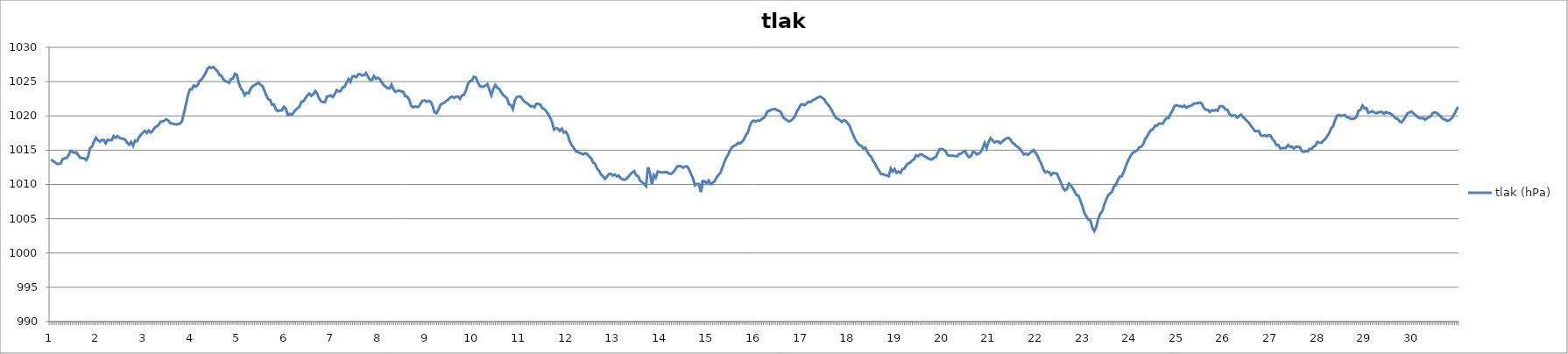
| Category | tlak (hPa) |
|---|---|
| 0 | 1013.63 |
| 1 | 1013.44 |
| 2 | 1013.25 |
| 3 | 1013 |
| 4 | 1013 |
| 5 | 1013.06 |
| 6 | 1013.69 |
| 7 | 1013.81 |
| 8 | 1013.88 |
| 9 | 1014.25 |
| 10 | 1014.88 |
| 11 | 1014.75 |
| 12 | 1014.63 |
| 13 | 1014.69 |
| 14 | 1014.25 |
| 15 | 1013.88 |
| 16 | 1013.88 |
| 17 | 1013.81 |
| 18 | 1013.56 |
| 19 | 1014.06 |
| 20 | 1015.31 |
| 21 | 1015.5 |
| 22 | 1016.25 |
| 23 | 1016.81 |
| 24 | 1016.44 |
| 25 | 1016.25 |
| 26 | 1016.5 |
| 27 | 1016.5 |
| 28 | 1016 |
| 29 | 1016.5 |
| 30 | 1016.44 |
| 31 | 1016.44 |
| 32 | 1017.06 |
| 33 | 1016.81 |
| 34 | 1017.06 |
| 35 | 1016.81 |
| 36 | 1016.69 |
| 37 | 1016.69 |
| 38 | 1016.5 |
| 39 | 1016.06 |
| 40 | 1015.81 |
| 41 | 1016.19 |
| 42 | 1015.63 |
| 43 | 1016.38 |
| 44 | 1016.31 |
| 45 | 1016.88 |
| 46 | 1017.25 |
| 47 | 1017.56 |
| 48 | 1017.81 |
| 49 | 1017.5 |
| 50 | 1017.88 |
| 51 | 1017.56 |
| 52 | 1017.81 |
| 53 | 1018.31 |
| 54 | 1018.44 |
| 55 | 1018.69 |
| 56 | 1019.13 |
| 57 | 1019.19 |
| 58 | 1019.31 |
| 59 | 1019.5 |
| 60 | 1019.31 |
| 61 | 1018.94 |
| 62 | 1018.88 |
| 63 | 1018.81 |
| 64 | 1018.75 |
| 65 | 1018.81 |
| 66 | 1018.88 |
| 67 | 1019.25 |
| 68 | 1020.44 |
| 69 | 1021.69 |
| 70 | 1023 |
| 71 | 1023.88 |
| 72 | 1023.88 |
| 73 | 1024.44 |
| 74 | 1024.25 |
| 75 | 1024.5 |
| 76 | 1025.13 |
| 77 | 1025.31 |
| 78 | 1025.75 |
| 79 | 1026.25 |
| 80 | 1026.88 |
| 81 | 1027.13 |
| 82 | 1027 |
| 83 | 1027.13 |
| 84 | 1026.81 |
| 85 | 1026.56 |
| 86 | 1026 |
| 87 | 1025.88 |
| 88 | 1025.38 |
| 89 | 1025.06 |
| 90 | 1025 |
| 91 | 1024.81 |
| 92 | 1025.38 |
| 93 | 1025.44 |
| 94 | 1026.13 |
| 95 | 1026 |
| 96 | 1024.75 |
| 97 | 1024.06 |
| 98 | 1023.63 |
| 99 | 1023 |
| 100 | 1023.38 |
| 101 | 1023.31 |
| 102 | 1023.94 |
| 103 | 1024.31 |
| 104 | 1024.5 |
| 105 | 1024.63 |
| 106 | 1024.88 |
| 107 | 1024.56 |
| 108 | 1024.38 |
| 109 | 1023.75 |
| 110 | 1023 |
| 111 | 1022.44 |
| 112 | 1022.31 |
| 113 | 1021.63 |
| 114 | 1021.63 |
| 115 | 1020.94 |
| 116 | 1020.69 |
| 117 | 1020.81 |
| 118 | 1020.81 |
| 119 | 1021.31 |
| 120 | 1021.06 |
| 121 | 1020.13 |
| 122 | 1020.31 |
| 123 | 1020.13 |
| 124 | 1020.5 |
| 125 | 1020.88 |
| 126 | 1021.13 |
| 127 | 1021.38 |
| 128 | 1022.06 |
| 129 | 1022.13 |
| 130 | 1022.56 |
| 131 | 1023 |
| 132 | 1023.25 |
| 133 | 1022.94 |
| 134 | 1023.13 |
| 135 | 1023.63 |
| 136 | 1023.25 |
| 137 | 1022.56 |
| 138 | 1022.13 |
| 139 | 1022 |
| 140 | 1022 |
| 141 | 1022.81 |
| 142 | 1022.88 |
| 143 | 1023 |
| 144 | 1022.75 |
| 145 | 1023.19 |
| 146 | 1023.75 |
| 147 | 1023.56 |
| 148 | 1023.63 |
| 149 | 1024.13 |
| 150 | 1024.25 |
| 151 | 1024.81 |
| 152 | 1025.38 |
| 153 | 1024.94 |
| 154 | 1025.75 |
| 155 | 1025.81 |
| 156 | 1025.63 |
| 157 | 1026.06 |
| 158 | 1026.06 |
| 159 | 1025.88 |
| 160 | 1025.94 |
| 161 | 1026.25 |
| 162 | 1025.69 |
| 163 | 1025.25 |
| 164 | 1025.25 |
| 165 | 1025.81 |
| 166 | 1025.44 |
| 167 | 1025.56 |
| 168 | 1025.38 |
| 169 | 1024.88 |
| 170 | 1024.5 |
| 171 | 1024.25 |
| 172 | 1024.06 |
| 173 | 1024 |
| 174 | 1024.56 |
| 175 | 1023.88 |
| 176 | 1023.5 |
| 177 | 1023.63 |
| 178 | 1023.69 |
| 179 | 1023.56 |
| 180 | 1023.5 |
| 181 | 1022.88 |
| 182 | 1022.81 |
| 183 | 1022.38 |
| 184 | 1021.5 |
| 185 | 1021.25 |
| 186 | 1021.38 |
| 187 | 1021.31 |
| 188 | 1021.38 |
| 189 | 1021.88 |
| 190 | 1022.25 |
| 191 | 1022.25 |
| 192 | 1022.06 |
| 193 | 1022.19 |
| 194 | 1022.06 |
| 195 | 1021.44 |
| 196 | 1020.5 |
| 197 | 1020.38 |
| 198 | 1020.94 |
| 199 | 1021.63 |
| 200 | 1021.81 |
| 201 | 1021.94 |
| 202 | 1022.19 |
| 203 | 1022.38 |
| 204 | 1022.69 |
| 205 | 1022.81 |
| 206 | 1022.63 |
| 207 | 1022.81 |
| 208 | 1022.81 |
| 209 | 1022.5 |
| 210 | 1023 |
| 211 | 1023.06 |
| 212 | 1023.69 |
| 213 | 1024.63 |
| 214 | 1025.06 |
| 215 | 1025.13 |
| 216 | 1025.69 |
| 217 | 1025.63 |
| 218 | 1024.94 |
| 219 | 1024.38 |
| 220 | 1024.25 |
| 221 | 1024.25 |
| 222 | 1024.44 |
| 223 | 1024.63 |
| 224 | 1023.81 |
| 225 | 1023 |
| 226 | 1023.94 |
| 227 | 1024.5 |
| 228 | 1024.13 |
| 229 | 1023.94 |
| 230 | 1023.44 |
| 231 | 1023.06 |
| 232 | 1022.81 |
| 233 | 1022.56 |
| 234 | 1021.69 |
| 235 | 1021.56 |
| 236 | 1021 |
| 237 | 1022.25 |
| 238 | 1022.75 |
| 239 | 1022.81 |
| 240 | 1022.81 |
| 241 | 1022.38 |
| 242 | 1022.06 |
| 243 | 1021.88 |
| 244 | 1021.69 |
| 245 | 1021.38 |
| 246 | 1021.44 |
| 247 | 1021.25 |
| 248 | 1021.75 |
| 249 | 1021.75 |
| 250 | 1021.63 |
| 251 | 1021.13 |
| 252 | 1021 |
| 253 | 1020.69 |
| 254 | 1020.25 |
| 255 | 1019.75 |
| 256 | 1019.13 |
| 257 | 1018 |
| 258 | 1018.19 |
| 259 | 1018.13 |
| 260 | 1017.81 |
| 261 | 1018.13 |
| 262 | 1017.56 |
| 263 | 1017.69 |
| 264 | 1017.25 |
| 265 | 1016.31 |
| 266 | 1015.75 |
| 267 | 1015.38 |
| 268 | 1014.88 |
| 269 | 1014.75 |
| 270 | 1014.63 |
| 271 | 1014.5 |
| 272 | 1014.38 |
| 273 | 1014.56 |
| 274 | 1014.44 |
| 275 | 1014.06 |
| 276 | 1013.81 |
| 277 | 1013.19 |
| 278 | 1013 |
| 279 | 1012.31 |
| 280 | 1012 |
| 281 | 1011.44 |
| 282 | 1011.19 |
| 283 | 1010.81 |
| 284 | 1011.13 |
| 285 | 1011.5 |
| 286 | 1011.56 |
| 287 | 1011.31 |
| 288 | 1011.44 |
| 289 | 1011.19 |
| 290 | 1011.31 |
| 291 | 1010.94 |
| 292 | 1010.75 |
| 293 | 1010.69 |
| 294 | 1010.81 |
| 295 | 1011.13 |
| 296 | 1011.5 |
| 297 | 1011.75 |
| 298 | 1011.94 |
| 299 | 1011.31 |
| 300 | 1011.19 |
| 301 | 1010.56 |
| 302 | 1010.31 |
| 303 | 1010.06 |
| 304 | 1009.75 |
| 305 | 1012.5 |
| 306 | 1011.69 |
| 307 | 1010.06 |
| 308 | 1011.38 |
| 309 | 1011 |
| 310 | 1011.88 |
| 311 | 1011.81 |
| 312 | 1011.75 |
| 313 | 1011.75 |
| 314 | 1011.81 |
| 315 | 1011.75 |
| 316 | 1011.56 |
| 317 | 1011.56 |
| 318 | 1011.81 |
| 319 | 1012.19 |
| 320 | 1012.63 |
| 321 | 1012.69 |
| 322 | 1012.63 |
| 323 | 1012.44 |
| 324 | 1012.63 |
| 325 | 1012.63 |
| 326 | 1012.19 |
| 327 | 1011.5 |
| 328 | 1010.88 |
| 329 | 1009.88 |
| 330 | 1010.06 |
| 331 | 1010.06 |
| 332 | 1008.88 |
| 333 | 1010.5 |
| 334 | 1010.44 |
| 335 | 1010.13 |
| 336 | 1010.56 |
| 337 | 1010.06 |
| 338 | 1010.25 |
| 339 | 1010.44 |
| 340 | 1011 |
| 341 | 1011.38 |
| 342 | 1011.69 |
| 343 | 1012.44 |
| 344 | 1013.25 |
| 345 | 1013.88 |
| 346 | 1014.38 |
| 347 | 1015 |
| 348 | 1015.44 |
| 349 | 1015.63 |
| 350 | 1015.75 |
| 351 | 1016.06 |
| 352 | 1016 |
| 353 | 1016.19 |
| 354 | 1016.56 |
| 355 | 1017.19 |
| 356 | 1017.56 |
| 357 | 1018.5 |
| 358 | 1019.13 |
| 359 | 1019.31 |
| 360 | 1019.19 |
| 361 | 1019.31 |
| 362 | 1019.31 |
| 363 | 1019.5 |
| 364 | 1019.69 |
| 365 | 1020 |
| 366 | 1020.63 |
| 367 | 1020.75 |
| 368 | 1020.88 |
| 369 | 1021 |
| 370 | 1021 |
| 371 | 1020.81 |
| 372 | 1020.75 |
| 373 | 1020.5 |
| 374 | 1019.81 |
| 375 | 1019.56 |
| 376 | 1019.38 |
| 377 | 1019.19 |
| 378 | 1019.31 |
| 379 | 1019.56 |
| 380 | 1019.88 |
| 381 | 1020.63 |
| 382 | 1021.06 |
| 383 | 1021.63 |
| 384 | 1021.69 |
| 385 | 1021.56 |
| 386 | 1021.81 |
| 387 | 1022.06 |
| 388 | 1022 |
| 389 | 1022.25 |
| 390 | 1022.38 |
| 391 | 1022.56 |
| 392 | 1022.69 |
| 393 | 1022.81 |
| 394 | 1022.63 |
| 395 | 1022.44 |
| 396 | 1021.94 |
| 397 | 1021.63 |
| 398 | 1021.25 |
| 399 | 1020.75 |
| 400 | 1020.19 |
| 401 | 1019.69 |
| 402 | 1019.56 |
| 403 | 1019.38 |
| 404 | 1019.13 |
| 405 | 1019.38 |
| 406 | 1019.25 |
| 407 | 1018.94 |
| 408 | 1018.56 |
| 409 | 1017.75 |
| 410 | 1017.13 |
| 411 | 1016.5 |
| 412 | 1016.06 |
| 413 | 1015.75 |
| 414 | 1015.63 |
| 415 | 1015.25 |
| 416 | 1015.38 |
| 417 | 1014.81 |
| 418 | 1014.31 |
| 419 | 1014.06 |
| 420 | 1013.44 |
| 421 | 1013.06 |
| 422 | 1012.44 |
| 423 | 1012.06 |
| 424 | 1011.5 |
| 425 | 1011.5 |
| 426 | 1011.38 |
| 427 | 1011.31 |
| 428 | 1011.19 |
| 429 | 1012.31 |
| 430 | 1011.88 |
| 431 | 1012.25 |
| 432 | 1011.69 |
| 433 | 1011.88 |
| 434 | 1011.69 |
| 435 | 1012.25 |
| 436 | 1012.31 |
| 437 | 1012.81 |
| 438 | 1013.06 |
| 439 | 1013.19 |
| 440 | 1013.5 |
| 441 | 1013.69 |
| 442 | 1014.25 |
| 443 | 1014.13 |
| 444 | 1014.38 |
| 445 | 1014.38 |
| 446 | 1014.13 |
| 447 | 1014 |
| 448 | 1013.81 |
| 449 | 1013.69 |
| 450 | 1013.63 |
| 451 | 1013.88 |
| 452 | 1014 |
| 453 | 1014.56 |
| 454 | 1015.13 |
| 455 | 1015.19 |
| 456 | 1015.06 |
| 457 | 1014.88 |
| 458 | 1014.31 |
| 459 | 1014.19 |
| 460 | 1014.19 |
| 461 | 1014.19 |
| 462 | 1014.13 |
| 463 | 1014.13 |
| 464 | 1014.44 |
| 465 | 1014.5 |
| 466 | 1014.75 |
| 467 | 1014.88 |
| 468 | 1014.31 |
| 469 | 1014 |
| 470 | 1014.13 |
| 471 | 1014.75 |
| 472 | 1014.69 |
| 473 | 1014.38 |
| 474 | 1014.5 |
| 475 | 1014.75 |
| 476 | 1015.31 |
| 477 | 1016.06 |
| 478 | 1015.31 |
| 479 | 1016.19 |
| 480 | 1016.75 |
| 481 | 1016.44 |
| 482 | 1016.13 |
| 483 | 1016.25 |
| 484 | 1016.25 |
| 485 | 1016 |
| 486 | 1016.25 |
| 487 | 1016.5 |
| 488 | 1016.69 |
| 489 | 1016.81 |
| 490 | 1016.63 |
| 491 | 1016.13 |
| 492 | 1015.94 |
| 493 | 1015.63 |
| 494 | 1015.44 |
| 495 | 1015.19 |
| 496 | 1014.81 |
| 497 | 1014.38 |
| 498 | 1014.5 |
| 499 | 1014.31 |
| 500 | 1014.56 |
| 501 | 1014.81 |
| 502 | 1015 |
| 503 | 1014.63 |
| 504 | 1014.19 |
| 505 | 1013.5 |
| 506 | 1013 |
| 507 | 1012.19 |
| 508 | 1011.75 |
| 509 | 1011.88 |
| 510 | 1011.75 |
| 511 | 1011.38 |
| 512 | 1011.69 |
| 513 | 1011.63 |
| 514 | 1011.56 |
| 515 | 1010.88 |
| 516 | 1010.25 |
| 517 | 1009.5 |
| 518 | 1009.13 |
| 519 | 1009.31 |
| 520 | 1010.13 |
| 521 | 1009.88 |
| 522 | 1009.44 |
| 523 | 1008.94 |
| 524 | 1008.44 |
| 525 | 1008.31 |
| 526 | 1007.56 |
| 527 | 1006.75 |
| 528 | 1005.81 |
| 529 | 1005.31 |
| 530 | 1004.88 |
| 531 | 1004.75 |
| 532 | 1003.69 |
| 533 | 1003.19 |
| 534 | 1003.81 |
| 535 | 1005 |
| 536 | 1005.69 |
| 537 | 1006.06 |
| 538 | 1006.94 |
| 539 | 1007.75 |
| 540 | 1008.38 |
| 541 | 1008.69 |
| 542 | 1008.88 |
| 543 | 1009.69 |
| 544 | 1009.88 |
| 545 | 1010.63 |
| 546 | 1011.13 |
| 547 | 1011.19 |
| 548 | 1011.81 |
| 549 | 1012.56 |
| 550 | 1013.31 |
| 551 | 1013.88 |
| 552 | 1014.38 |
| 553 | 1014.69 |
| 554 | 1014.81 |
| 555 | 1015 |
| 556 | 1015.44 |
| 557 | 1015.5 |
| 558 | 1015.88 |
| 559 | 1016.63 |
| 560 | 1017 |
| 561 | 1017.56 |
| 562 | 1017.94 |
| 563 | 1018.06 |
| 564 | 1018.56 |
| 565 | 1018.56 |
| 566 | 1018.88 |
| 567 | 1018.88 |
| 568 | 1018.88 |
| 569 | 1019.38 |
| 570 | 1019.69 |
| 571 | 1019.69 |
| 572 | 1020.31 |
| 573 | 1020.81 |
| 574 | 1021.44 |
| 575 | 1021.56 |
| 576 | 1021.44 |
| 577 | 1021.44 |
| 578 | 1021.31 |
| 579 | 1021.5 |
| 580 | 1021.19 |
| 581 | 1021.38 |
| 582 | 1021.44 |
| 583 | 1021.56 |
| 584 | 1021.81 |
| 585 | 1021.81 |
| 586 | 1021.88 |
| 587 | 1021.94 |
| 588 | 1021.75 |
| 589 | 1021.13 |
| 590 | 1020.88 |
| 591 | 1020.88 |
| 592 | 1020.56 |
| 593 | 1020.81 |
| 594 | 1020.75 |
| 595 | 1020.88 |
| 596 | 1020.75 |
| 597 | 1021.38 |
| 598 | 1021.44 |
| 599 | 1021.31 |
| 600 | 1020.94 |
| 601 | 1020.88 |
| 602 | 1020.31 |
| 603 | 1020 |
| 604 | 1020.06 |
| 605 | 1020.06 |
| 606 | 1019.75 |
| 607 | 1020 |
| 608 | 1020.19 |
| 609 | 1019.81 |
| 610 | 1019.56 |
| 611 | 1019.25 |
| 612 | 1019 |
| 613 | 1018.56 |
| 614 | 1018.19 |
| 615 | 1017.81 |
| 616 | 1017.75 |
| 617 | 1017.81 |
| 618 | 1017.19 |
| 619 | 1017.06 |
| 620 | 1017.19 |
| 621 | 1017 |
| 622 | 1017.19 |
| 623 | 1017.13 |
| 624 | 1016.63 |
| 625 | 1016.31 |
| 626 | 1015.75 |
| 627 | 1015.75 |
| 628 | 1015.25 |
| 629 | 1015.31 |
| 630 | 1015.31 |
| 631 | 1015.38 |
| 632 | 1015.75 |
| 633 | 1015.5 |
| 634 | 1015.5 |
| 635 | 1015.25 |
| 636 | 1015.5 |
| 637 | 1015.5 |
| 638 | 1015.44 |
| 639 | 1014.88 |
| 640 | 1014.75 |
| 641 | 1014.88 |
| 642 | 1014.81 |
| 643 | 1015.19 |
| 644 | 1015.19 |
| 645 | 1015.5 |
| 646 | 1015.69 |
| 647 | 1016.19 |
| 648 | 1016.06 |
| 649 | 1016.06 |
| 650 | 1016.38 |
| 651 | 1016.63 |
| 652 | 1017.06 |
| 653 | 1017.5 |
| 654 | 1018.19 |
| 655 | 1018.5 |
| 656 | 1019.38 |
| 657 | 1020 |
| 658 | 1020.13 |
| 659 | 1020 |
| 660 | 1020.06 |
| 661 | 1020.13 |
| 662 | 1019.81 |
| 663 | 1019.75 |
| 664 | 1019.56 |
| 665 | 1019.56 |
| 666 | 1019.63 |
| 667 | 1019.88 |
| 668 | 1020.75 |
| 669 | 1020.88 |
| 670 | 1021.5 |
| 671 | 1021.13 |
| 672 | 1021.13 |
| 673 | 1020.44 |
| 674 | 1020.56 |
| 675 | 1020.69 |
| 676 | 1020.5 |
| 677 | 1020.38 |
| 678 | 1020.5 |
| 679 | 1020.56 |
| 680 | 1020.56 |
| 681 | 1020.31 |
| 682 | 1020.56 |
| 683 | 1020.44 |
| 684 | 1020.38 |
| 685 | 1020.19 |
| 686 | 1019.94 |
| 687 | 1019.63 |
| 688 | 1019.56 |
| 689 | 1019.19 |
| 690 | 1019.06 |
| 691 | 1019.44 |
| 692 | 1019.88 |
| 693 | 1020.38 |
| 694 | 1020.5 |
| 695 | 1020.63 |
| 696 | 1020.38 |
| 697 | 1020.13 |
| 698 | 1019.88 |
| 699 | 1019.69 |
| 700 | 1019.63 |
| 701 | 1019.69 |
| 702 | 1019.44 |
| 703 | 1019.69 |
| 704 | 1019.81 |
| 705 | 1020 |
| 706 | 1020.44 |
| 707 | 1020.5 |
| 708 | 1020.44 |
| 709 | 1020.13 |
| 710 | 1019.94 |
| 711 | 1019.56 |
| 712 | 1019.5 |
| 713 | 1019.31 |
| 714 | 1019.31 |
| 715 | 1019.5 |
| 716 | 1019.81 |
| 717 | 1020.31 |
| 718 | 1020.88 |
| 719 | 1021.31 |